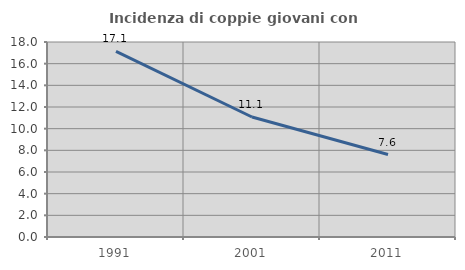
| Category | Incidenza di coppie giovani con figli |
|---|---|
| 1991.0 | 17.133 |
| 2001.0 | 11.075 |
| 2011.0 | 7.612 |